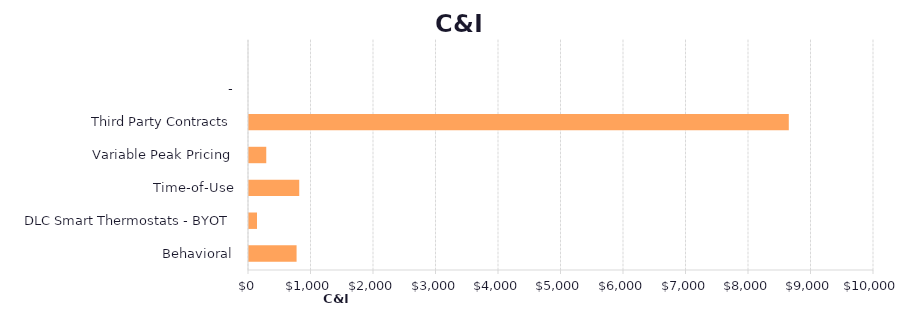
| Category | Series 1 |
|---|---|
| Behavioral | 761.266 |
| DLC Smart Thermostats - BYOT | 127.925 |
| Time-of-Use | 803.715 |
| Variable Peak Pricing | 276.193 |
| Third Party Contracts | 8636.754 |
| - | 0 |